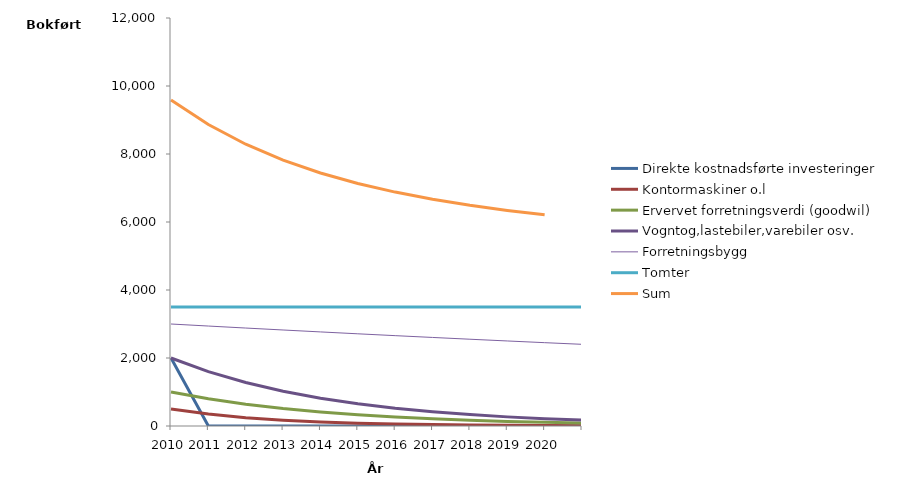
| Category | Direkte kostnadsførte investeringer | Kontormaskiner o.l | Ervervet forretningsverdi (goodwil)  | Vogntog,lastebiler,varebiler osv. | Personbiler,traktorer,andre rullende maskiner | Skip,fartøyer,rigger m.v. | Fly,helikoptre | Anlegg for overføring og distribusjon av elektrisk kraft m.v. | Bygg og anlegg, hoteller | Forretningsbygg | Tomter | Sum |
|---|---|---|---|---|---|---|---|---|---|---|---|---|
| 2010.0 | 2000 | 500 | 1000 | 2000 |  |  |  |  |  | 3000 | 3500 | 9590 |
| 2011.0 | 0 | 350 | 800 | 1600 |  |  |  |  |  | 2940 | 3500 | 8866.2 |
| 2012.0 | 0 | 245 | 640 | 1280 |  |  |  |  |  | 2881.2 | 3500 | 8287.076 |
| 2013.0 | 0 | 171.5 | 512 | 1024 |  |  |  |  |  | 2823.576 | 3500 | 7820.754 |
| 2014.0 | 0 | 120.05 | 409.6 | 819.2 |  |  |  |  |  | 2767.104 | 3500 | 7442.677 |
| 2015.0 | 0 | 84.035 | 327.68 | 655.36 |  |  |  |  |  | 2711.762 | 3500 | 7133.856 |
| 2016.0 | 0 | 58.824 | 262.144 | 524.288 |  |  |  |  |  | 2657.527 | 3500 | 6879.557 |
| 2017.0 | 0 | 41.177 | 209.715 | 419.43 |  |  |  |  |  | 2604.377 | 3500 | 6668.316 |
| 2018.0 | 0 | 28.824 | 167.772 | 335.544 |  |  |  |  |  | 2552.289 | 3500 | 6491.182 |
| 2019.0 | 0 | 20.177 | 134.218 | 268.435 |  |  |  |  |  | 2501.243 | 3500 | 6341.152 |
| 2020.0 | 0 | 14.124 | 107.374 | 214.748 |  |  |  |  |  | 2451.218 | 3500 | 6212.728 |